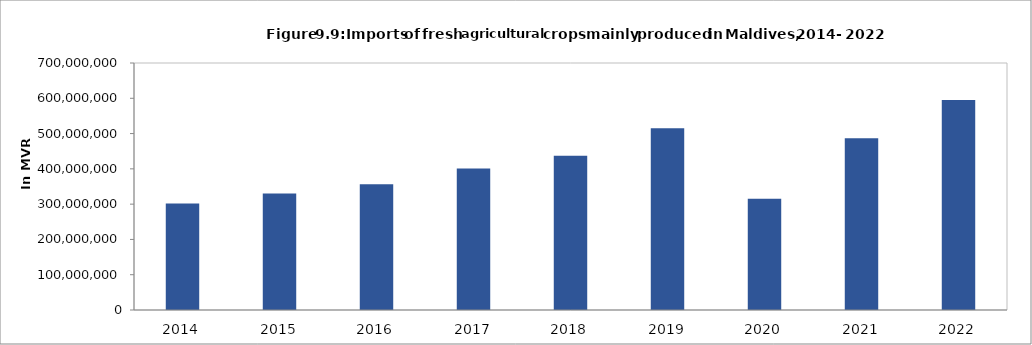
| Category | Series 0 |
|---|---|
| 2014.0 | 302002607.59 |
| 2015.0 | 330503715.94 |
| 2016.0 | 356030840.87 |
| 2017.0 | 400897835.123 |
| 2018.0 | 437440288.2 |
| 2019.0 | 514951812.51 |
| 2020.0 | 314954008.74 |
| 2021.0 | 486970834.09 |
| 2022.0 | 595470253.66 |